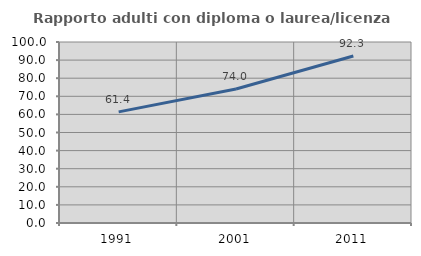
| Category | Rapporto adulti con diploma o laurea/licenza media  |
|---|---|
| 1991.0 | 61.396 |
| 2001.0 | 74.015 |
| 2011.0 | 92.297 |